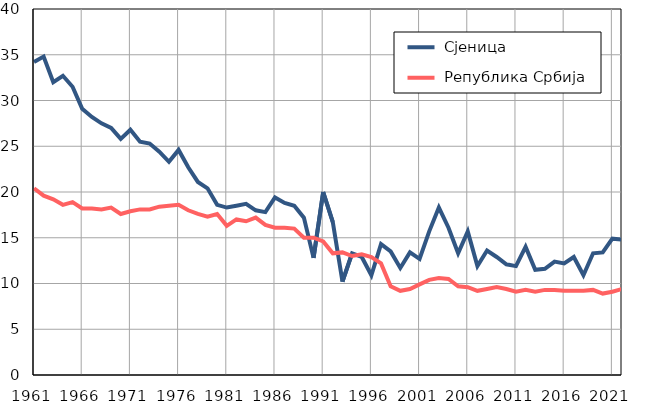
| Category |  Сјеница |  Република Србија |
|---|---|---|
| 1961.0 | 34.2 | 20.4 |
| 1962.0 | 34.8 | 19.6 |
| 1963.0 | 32 | 19.2 |
| 1964.0 | 32.7 | 18.6 |
| 1965.0 | 31.5 | 18.9 |
| 1966.0 | 29.1 | 18.2 |
| 1967.0 | 28.2 | 18.2 |
| 1968.0 | 27.5 | 18.1 |
| 1969.0 | 27 | 18.3 |
| 1970.0 | 25.8 | 17.6 |
| 1971.0 | 26.8 | 17.9 |
| 1972.0 | 25.5 | 18.1 |
| 1973.0 | 25.3 | 18.1 |
| 1974.0 | 24.4 | 18.4 |
| 1975.0 | 23.3 | 18.5 |
| 1976.0 | 24.6 | 18.6 |
| 1977.0 | 22.7 | 18 |
| 1978.0 | 21.1 | 17.6 |
| 1979.0 | 20.4 | 17.3 |
| 1980.0 | 18.6 | 17.6 |
| 1981.0 | 18.3 | 16.3 |
| 1982.0 | 18.5 | 17 |
| 1983.0 | 18.7 | 16.8 |
| 1984.0 | 18 | 17.2 |
| 1985.0 | 17.8 | 16.4 |
| 1986.0 | 19.4 | 16.1 |
| 1987.0 | 18.8 | 16.1 |
| 1988.0 | 18.5 | 16 |
| 1989.0 | 17.2 | 15 |
| 1990.0 | 12.8 | 15 |
| 1991.0 | 20 | 14.6 |
| 1992.0 | 16.7 | 13.3 |
| 1993.0 | 10.2 | 13.4 |
| 1994.0 | 13.3 | 13 |
| 1995.0 | 12.9 | 13.2 |
| 1996.0 | 10.9 | 12.9 |
| 1997.0 | 14.3 | 12.2 |
| 1998.0 | 13.5 | 9.7 |
| 1999.0 | 11.7 | 9.2 |
| 2000.0 | 13.4 | 9.4 |
| 2001.0 | 12.7 | 9.9 |
| 2002.0 | 15.7 | 10.4 |
| 2003.0 | 18.3 | 10.6 |
| 2004.0 | 16.1 | 10.5 |
| 2005.0 | 13.3 | 9.7 |
| 2006.0 | 15.7 | 9.6 |
| 2007.0 | 11.9 | 9.2 |
| 2008.0 | 13.6 | 9.4 |
| 2009.0 | 12.9 | 9.6 |
| 2010.0 | 12.1 | 9.4 |
| 2011.0 | 11.9 | 9.1 |
| 2012.0 | 14 | 9.3 |
| 2013.0 | 11.5 | 9.1 |
| 2014.0 | 11.6 | 9.3 |
| 2015.0 | 12.4 | 9.3 |
| 2016.0 | 12.2 | 9.2 |
| 2017.0 | 12.9 | 9.2 |
| 2018.0 | 10.9 | 9.2 |
| 2019.0 | 13.3 | 9.3 |
| 2020.0 | 13.4 | 8.9 |
| 2021.0 | 14.9 | 9.1 |
| 2022.0 | 14.8 | 9.4 |